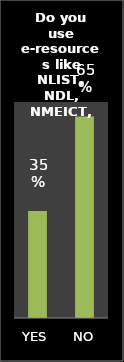
| Category | Series 0 |
|---|---|
| YES | 0.347 |
| NO | 0.653 |